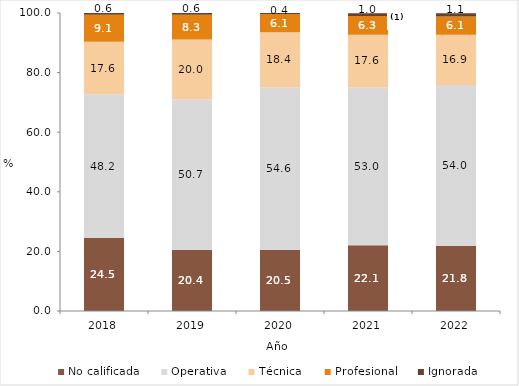
| Category | No calificada | Operativa | Técnica | Profesional | Ignorada |
|---|---|---|---|---|---|
| 2018 | 24.499 | 48.238 | 17.6 | 9.062 | 0.601 |
| 2019 | 20.43 | 50.666 | 19.988 | 8.325 | 0.591 |
| 2020 | 20.518 | 54.602 | 18.412 | 6.1 | 0.414 |
| 2021 | 22.1 | 53.014 | 17.56 | 6.295 | 0.967 |
| 2022 | 21.8 | 54 | 16.9 | 6.1 | 1.1 |